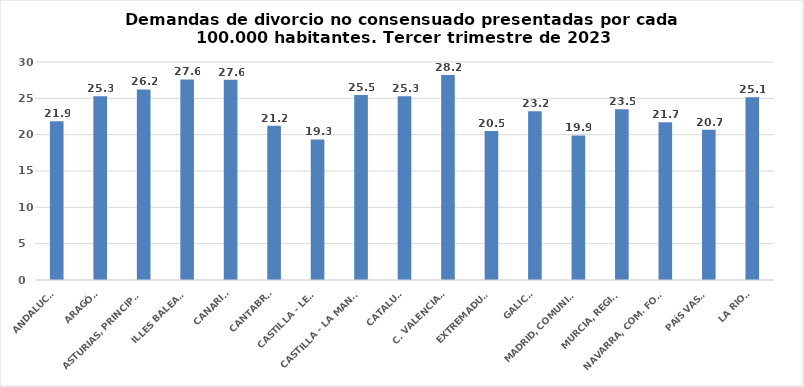
| Category | Series 0 |
|---|---|
| ANDALUCÍA | 21.852 |
| ARAGÓN | 25.272 |
| ASTURIAS, PRINCIPADO | 26.227 |
| ILLES BALEARS | 27.595 |
| CANARIAS | 27.566 |
| CANTABRIA | 21.239 |
| CASTILLA - LEÓN | 19.349 |
| CASTILLA - LA MANCHA | 25.473 |
| CATALUÑA | 25.294 |
| C. VALENCIANA | 28.228 |
| EXTREMADURA | 20.487 |
| GALICIA | 23.225 |
| MADRID, COMUNIDAD | 19.901 |
| MURCIA, REGIÓN | 23.508 |
| NAVARRA, COM. FORAL | 21.72 |
| PAÍS VASCO | 20.677 |
| LA RIOJA | 25.135 |